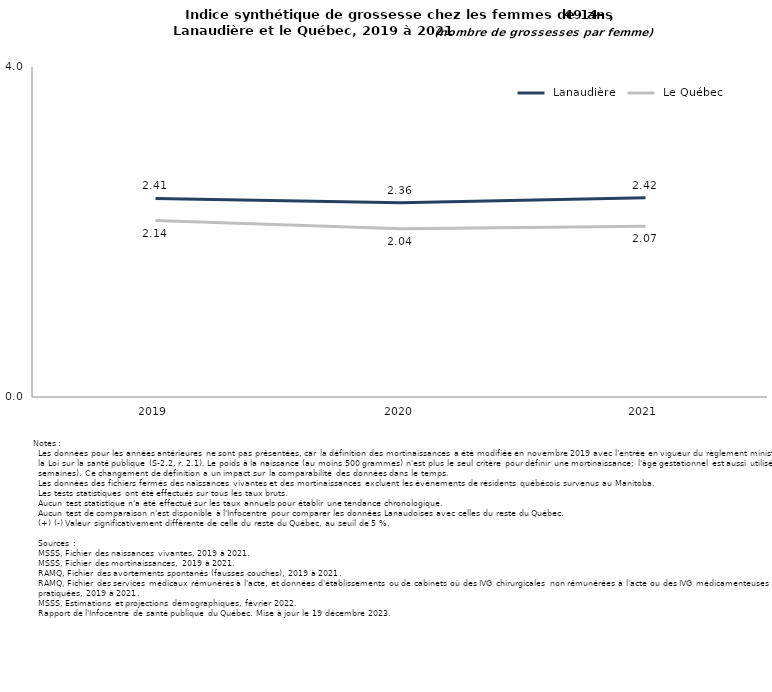
| Category |  Lanaudière |  Le Québec |
|---|---|---|
| 2019.0 | 2.407 | 2.138 |
| 2020.0 | 2.356 | 2.039 |
| 2021.0 | 2.415 | 2.069 |